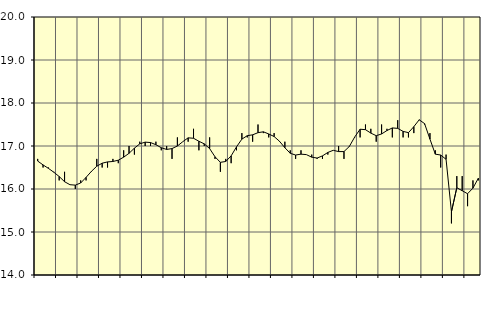
| Category | Piggar | Handel, SNI 45-471 |
|---|---|---|
| nan | 16.7 | 16.65 |
| 1.0 | 16.5 | 16.56 |
| 1.0 | 16.5 | 16.48 |
| 1.0 | 16.4 | 16.39 |
| nan | 16.2 | 16.29 |
| 2.0 | 16.4 | 16.17 |
| 2.0 | 16.1 | 16.1 |
| 2.0 | 16 | 16.09 |
| nan | 16.2 | 16.14 |
| 3.0 | 16.2 | 16.27 |
| 3.0 | 16.4 | 16.41 |
| 3.0 | 16.7 | 16.53 |
| nan | 16.5 | 16.6 |
| 4.0 | 16.5 | 16.63 |
| 4.0 | 16.7 | 16.64 |
| 4.0 | 16.6 | 16.67 |
| nan | 16.9 | 16.74 |
| 5.0 | 17 | 16.83 |
| 5.0 | 16.8 | 16.95 |
| 5.0 | 17.1 | 17.05 |
| nan | 17 | 17.09 |
| 6.0 | 17 | 17.08 |
| 6.0 | 17.1 | 17.03 |
| 6.0 | 16.9 | 16.96 |
| nan | 17 | 16.92 |
| 7.0 | 16.7 | 16.94 |
| 7.0 | 17.2 | 17 |
| 7.0 | 17.1 | 17.1 |
| nan | 17.1 | 17.19 |
| 8.0 | 17.4 | 17.18 |
| 8.0 | 16.9 | 17.11 |
| 8.0 | 17 | 17.05 |
| nan | 17.2 | 16.94 |
| 9.0 | 16.7 | 16.75 |
| 9.0 | 16.4 | 16.62 |
| 9.0 | 16.7 | 16.64 |
| nan | 16.6 | 16.77 |
| 10.0 | 16.9 | 16.98 |
| 10.0 | 17.3 | 17.16 |
| 10.0 | 17.2 | 17.24 |
| nan | 17.1 | 17.26 |
| 11.0 | 17.5 | 17.31 |
| 11.0 | 17.3 | 17.33 |
| 11.0 | 17.2 | 17.28 |
| nan | 17.3 | 17.22 |
| 12.0 | 17.1 | 17.11 |
| 12.0 | 17.1 | 16.96 |
| 12.0 | 16.9 | 16.83 |
| nan | 16.7 | 16.79 |
| 13.0 | 16.9 | 16.81 |
| 13.0 | 16.8 | 16.8 |
| 13.0 | 16.8 | 16.74 |
| nan | 16.7 | 16.72 |
| 14.0 | 16.7 | 16.77 |
| 14.0 | 16.8 | 16.85 |
| 14.0 | 16.9 | 16.9 |
| nan | 17 | 16.87 |
| 15.0 | 16.7 | 16.87 |
| 15.0 | 17 | 16.99 |
| 15.0 | 17.2 | 17.21 |
| nan | 17.2 | 17.39 |
| 16.0 | 17.5 | 17.38 |
| 16.0 | 17.4 | 17.3 |
| 16.0 | 17.1 | 17.24 |
| nan | 17.5 | 17.28 |
| 17.0 | 17.4 | 17.36 |
| 17.0 | 17.2 | 17.42 |
| 17.0 | 17.6 | 17.41 |
| nan | 17.2 | 17.34 |
| 18.0 | 17.2 | 17.31 |
| 18.0 | 17.3 | 17.45 |
| 18.0 | 17.6 | 17.61 |
| nan | 17.5 | 17.52 |
| 19.0 | 17.3 | 17.16 |
| 19.0 | 16.9 | 16.81 |
| 19.0 | 16.5 | 16.79 |
| nan | 16.8 | 16.69 |
| 20.0 | 15.2 | 15.47 |
| 20.0 | 16.3 | 16.03 |
| 20.0 | 16.3 | 15.96 |
| nan | 15.6 | 15.89 |
| 21.0 | 16.2 | 16.02 |
| 21.0 | 16.2 | 16.25 |